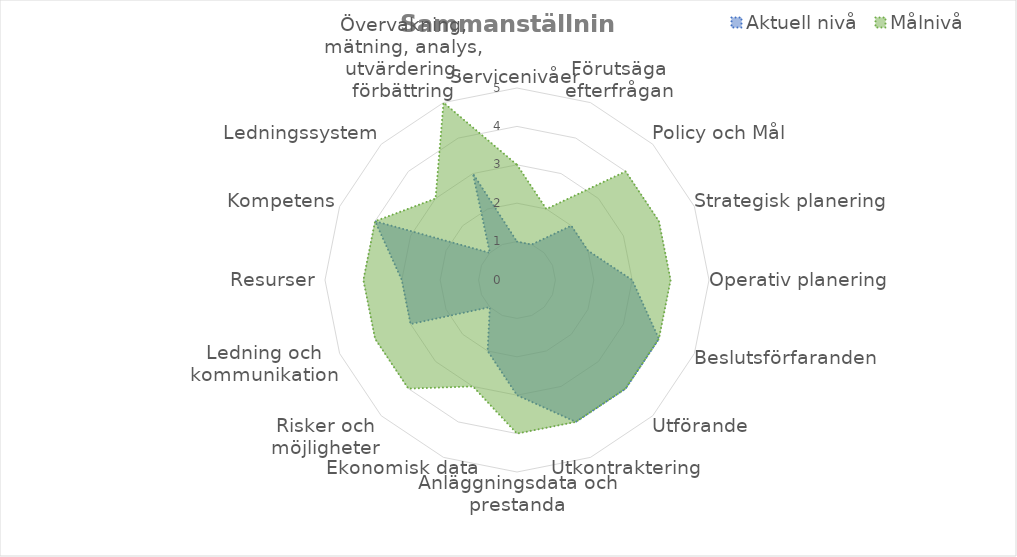
| Category | Aktuell nivå | Målnivå |
|---|---|---|
| 0 | 1 | 3 |
| 1 | 1 | 2 |
| 2 | 2 | 4 |
| 3 | 2 | 4 |
| 4 | 3 | 4 |
| 5 | 4 | 4 |
| 6 | 4 | 4 |
| 7 | 4 | 4 |
| 8 | 3 | 4 |
| 9 | 2 | 3 |
| 10 | 1 | 4 |
| 11 | 3 | 4 |
| 12 | 3 | 4 |
| 13 | 4 | 4 |
| 14 | 1 | 3 |
| 15 | 3 | 5 |